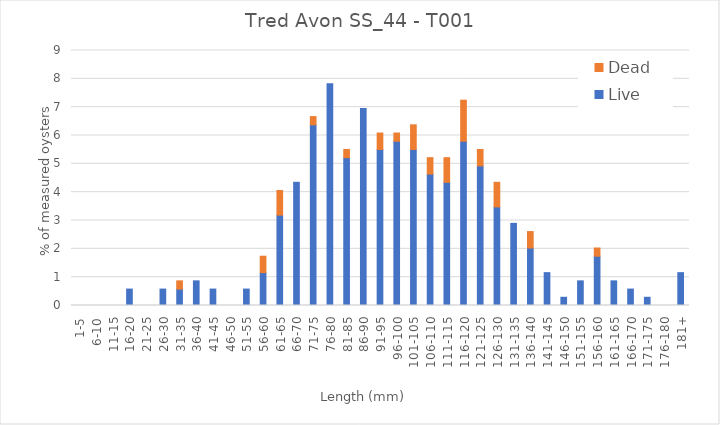
| Category | Live | Dead |
|---|---|---|
| 1-5 | 0 | 0 |
| 6-10 | 0 | 0 |
| 11-15 | 0 | 0 |
| 16-20 | 0.58 | 0 |
| 21-25 | 0 | 0 |
| 26-30 | 0.58 | 0 |
| 31-35 | 0.58 | 0.29 |
| 36-40 | 0.87 | 0 |
| 41-45 | 0.58 | 0 |
| 46-50 | 0 | 0 |
| 51-55 | 0.58 | 0 |
| 56-60 | 1.159 | 0.58 |
| 61-65 | 3.188 | 0.87 |
| 66-70 | 4.348 | 0 |
| 71-75 | 6.377 | 0.29 |
| 76-80 | 7.826 | 0 |
| 81-85 | 5.217 | 0.29 |
| 86-90 | 6.957 | 0 |
| 91-95 | 5.507 | 0.58 |
| 96-100 | 5.797 | 0.29 |
| 101-105 | 5.507 | 0.87 |
| 106-110 | 4.638 | 0.58 |
| 111-115 | 4.348 | 0.87 |
| 116-120 | 5.797 | 1.449 |
| 121-125 | 4.928 | 0.58 |
| 126-130 | 3.478 | 0.87 |
| 131-135 | 2.899 | 0 |
| 136-140 | 2.029 | 0.58 |
| 141-145 | 1.159 | 0 |
| 146-150 | 0.29 | 0 |
| 151-155 | 0.87 | 0 |
| 156-160 | 1.739 | 0.29 |
| 161-165 | 0.87 | 0 |
| 166-170 | 0.58 | 0 |
| 171-175 | 0.29 | 0 |
| 176-180 | 0 | 0 |
| 181+ | 1.159 | 0 |